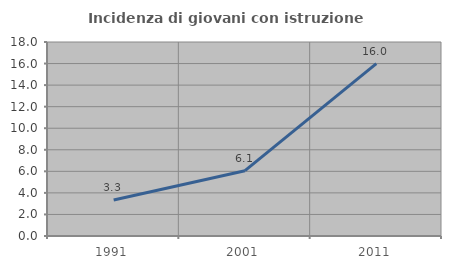
| Category | Incidenza di giovani con istruzione universitaria |
|---|---|
| 1991.0 | 3.333 |
| 2001.0 | 6.061 |
| 2011.0 | 16 |